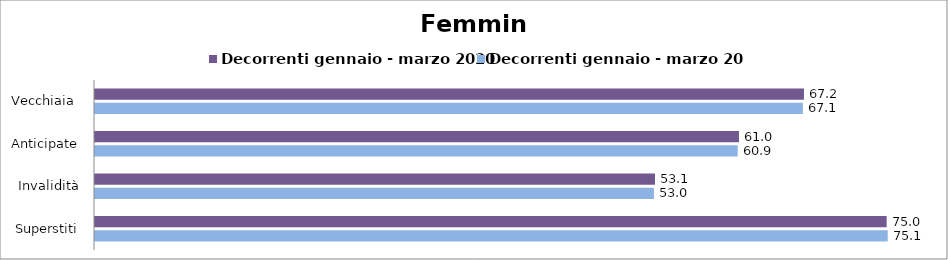
| Category | Decorrenti gennaio - marzo 2020 | Decorrenti gennaio - marzo 2021 |
|---|---|---|
| Vecchiaia  | 67.2 | 67.1 |
| Anticipate | 61.04 | 60.92 |
| Invalidità | 53.08 | 52.98 |
| Superstiti | 75.04 | 75.14 |